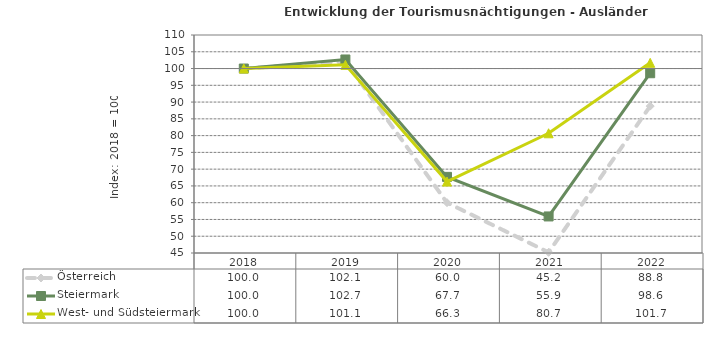
| Category | Österreich | Steiermark | West- und Südsteiermark |
|---|---|---|---|
| 2022.0 | 88.8 | 98.6 | 101.7 |
| 2021.0 | 45.2 | 55.9 | 80.7 |
| 2020.0 | 60 | 67.7 | 66.3 |
| 2019.0 | 102.1 | 102.7 | 101.1 |
| 2018.0 | 100 | 100 | 100 |